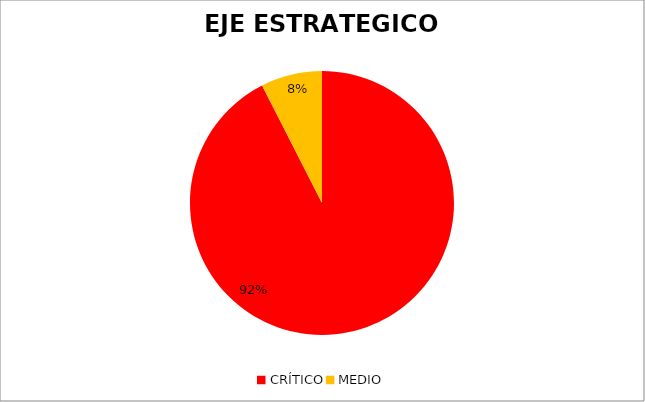
| Category | Series 0 |
|---|---|
| CRÍTICO | 37 |
| MEDIO | 3 |